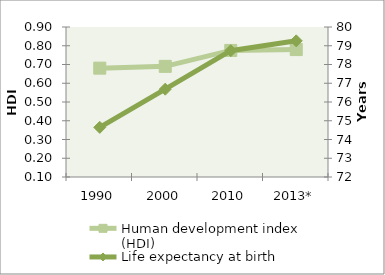
| Category | Human development index (HDI) |
|---|---|
| 1990 | 0.681 |
| 2000 | 0.69 |
| 2010 | 0.775 |
| 2013* | 0.78 |